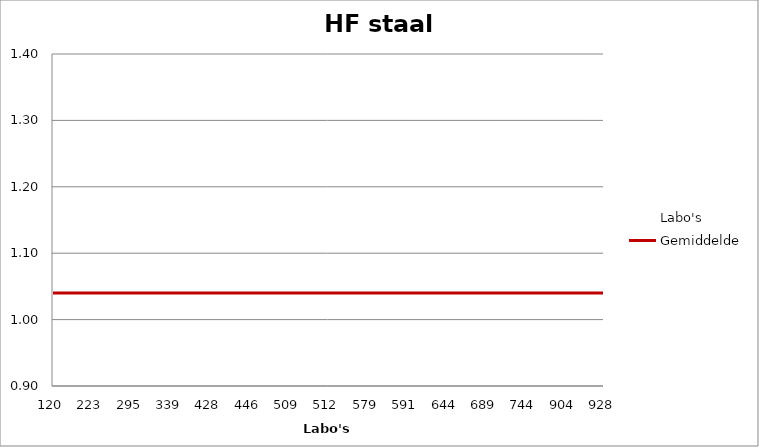
| Category | Labo's | Gemiddelde |
|---|---|---|
| 120.0 | 1.04 | 1.04 |
| 223.0 | 1.03 | 1.04 |
| 295.0 | 0.95 | 1.04 |
| 339.0 | 0.97 | 1.04 |
| 428.0 | 1.3 | 1.04 |
| 446.0 | 1.05 | 1.04 |
| 509.0 | 1.05 | 1.04 |
| 512.0 | 1.09 | 1.04 |
| 579.0 | 1.05 | 1.04 |
| 591.0 | 1.21 | 1.04 |
| 644.0 | 1.01 | 1.04 |
| 689.0 | 1.08 | 1.04 |
| 744.0 | 0.98 | 1.04 |
| 904.0 | 1.04 | 1.04 |
| 928.0 | 1.04 | 1.04 |